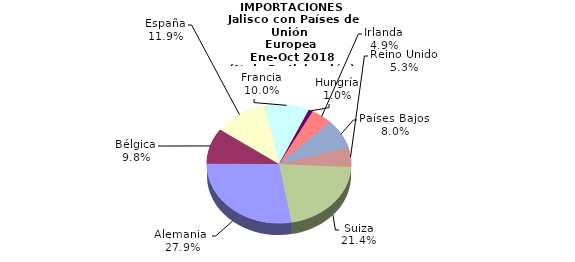
| Category | IMPORTACIONES |
|---|---|
| Alemania  | 1422.649 |
| Bélgica | 498.238 |
| España | 605.762 |
| Francia | 512.552 |
| Hungría | 48.564 |
| Irlanda | 248.239 |
| Países Bajos  | 407.923 |
| Reino Unido | 269.263 |
| Suiza | 1094.685 |